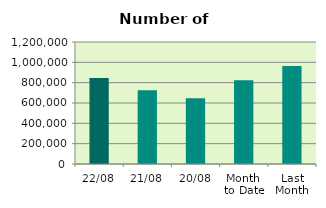
| Category | Series 0 |
|---|---|
| 22/08 | 846338 |
| 21/08 | 726224 |
| 20/08 | 646554 |
| Month 
to Date | 822627.75 |
| Last
Month | 964212.818 |